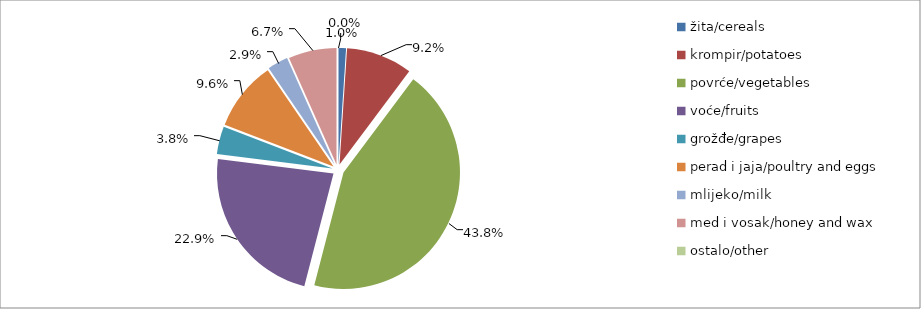
| Category | Series 0 |
|---|---|
| žita/cereals | 23859 |
| krompir/potatoes | 211045 |
| povrće/vegetables | 1007316.5 |
| voće/fruits | 527404 |
| grožđe/grapes | 88503 |
| perad i jaja/poultry and eggs | 221314 |
| mlijeko/milk | 65939 |
| med i vosak/honey and wax | 153565 |
| ostalo/other | 0 |